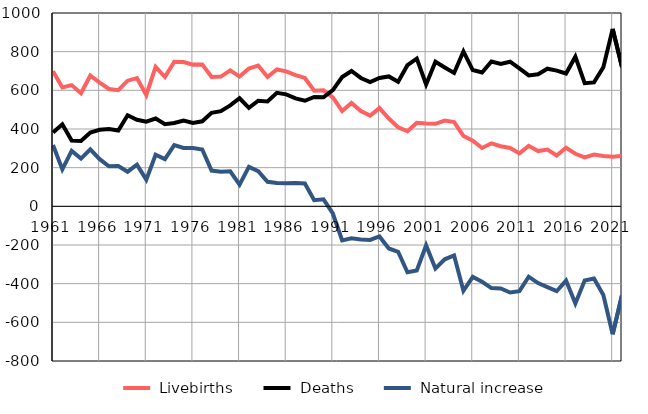
| Category |  Livebirths |  Deaths |  Natural increase |
|---|---|---|---|
| 1961.0 | 699 | 382 | 317 |
| 1962.0 | 615 | 424 | 191 |
| 1963.0 | 627 | 340 | 287 |
| 1964.0 | 585 | 338 | 247 |
| 1965.0 | 677 | 382 | 295 |
| 1966.0 | 640 | 396 | 244 |
| 1967.0 | 607 | 400 | 207 |
| 1968.0 | 601 | 392 | 209 |
| 1969.0 | 650 | 471 | 179 |
| 1970.0 | 663 | 448 | 215 |
| 1971.0 | 576 | 438 | 138 |
| 1972.0 | 721 | 454 | 267 |
| 1973.0 | 669 | 425 | 244 |
| 1974.0 | 748 | 431 | 317 |
| 1975.0 | 746 | 444 | 302 |
| 1976.0 | 733 | 431 | 302 |
| 1977.0 | 734 | 440 | 294 |
| 1978.0 | 669 | 484 | 185 |
| 1979.0 | 671 | 492 | 179 |
| 1980.0 | 703 | 522 | 181 |
| 1981.0 | 671 | 559 | 112 |
| 1982.0 | 713 | 509 | 204 |
| 1983.0 | 728 | 546 | 182 |
| 1984.0 | 669 | 542 | 127 |
| 1985.0 | 708 | 587 | 121 |
| 1986.0 | 698 | 579 | 119 |
| 1987.0 | 679 | 558 | 121 |
| 1988.0 | 664 | 546 | 118 |
| 1989.0 | 598 | 566 | 32 |
| 1990.0 | 600 | 564 | 36 |
| 1991.0 | 564 | 601 | -37 |
| 1992.0 | 493 | 669 | -176 |
| 1993.0 | 535 | 700 | -165 |
| 1994.0 | 493 | 664 | -171 |
| 1995.0 | 469 | 643 | -174 |
| 1996.0 | 508 | 664 | -156 |
| 1997.0 | 454 | 672 | -218 |
| 1998.0 | 409 | 644 | -235 |
| 1999.0 | 389 | 730 | -341 |
| 2000.0 | 432 | 764 | -332 |
| 2001.0 | 428 | 630 | -202 |
| 2002.0 | 427 | 748 | -321 |
| 2003.0 | 444 | 718 | -274 |
| 2004.0 | 436 | 690 | -254 |
| 2005.0 | 364 | 801 | -437 |
| 2006.0 | 340 | 705 | -365 |
| 2007.0 | 302 | 692 | -390 |
| 2008.0 | 326 | 749 | -423 |
| 2009.0 | 311 | 736 | -425 |
| 2010.0 | 302 | 748 | -446 |
| 2011.0 | 274 | 713 | -439 |
| 2012.0 | 313 | 677 | -364 |
| 2013.0 | 286 | 683 | -397 |
| 2014.0 | 294 | 712 | -418 |
| 2015.0 | 263 | 702 | -439 |
| 2016.0 | 303 | 687 | -384 |
| 2017.0 | 272 | 774 | -502 |
| 2018.0 | 253 | 637 | -384 |
| 2019.0 | 268 | 641 | -373 |
| 2020.0 | 260 | 719 | -459 |
| 2021.0 | 256 | 918 | -662 |
| 2022.0 | 261 | 721 | -460 |